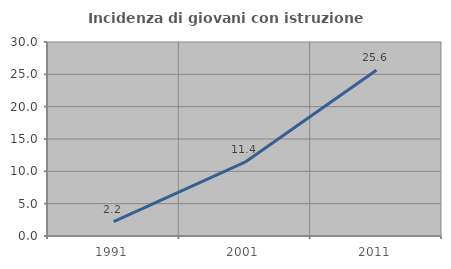
| Category | Incidenza di giovani con istruzione universitaria |
|---|---|
| 1991.0 | 2.235 |
| 2001.0 | 11.409 |
| 2011.0 | 25.628 |